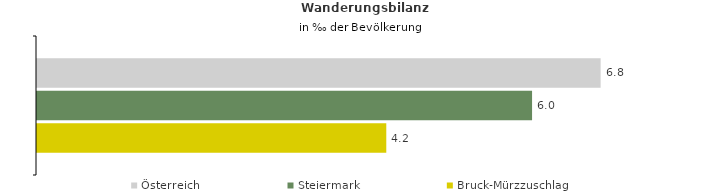
| Category | Österreich | Steiermark | Bruck-Mürzzuschlag |
|---|---|---|---|
| Wanderungsrate in ‰ der Bevölkerung, Periode 2018-2022 | 6.822 | 5.992 | 4.227 |